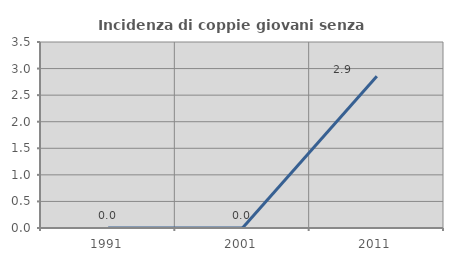
| Category | Incidenza di coppie giovani senza figli |
|---|---|
| 1991.0 | 0 |
| 2001.0 | 0 |
| 2011.0 | 2.857 |